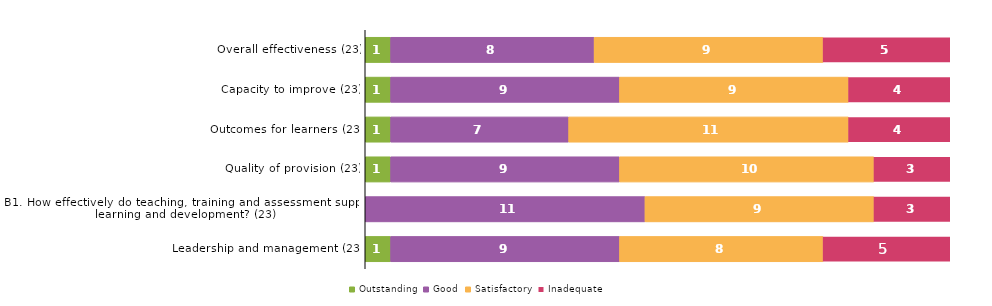
| Category | Outstanding | Good | Satisfactory | Inadequate |
|---|---|---|---|---|
| Overall effectiveness (23) | 1 | 8 | 9 | 5 |
| Capacity to improve (23) | 1 | 9 | 9 | 4 |
| Outcomes for learners (23) | 1 | 7 | 11 | 4 |
| Quality of provision (23) | 1 | 9 | 10 | 3 |
| B1. How effectively do teaching, training and assessment support learning and development? (23) | 0 | 11 | 9 | 3 |
| Leadership and management (23) | 1 | 9 | 8 | 5 |